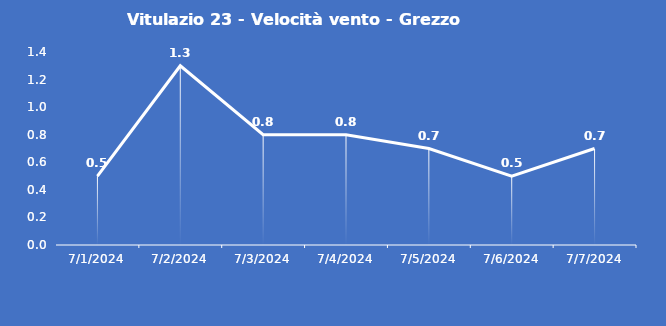
| Category | Vitulazio 23 - Velocità vento - Grezzo (m/s) |
|---|---|
| 7/1/24 | 0.5 |
| 7/2/24 | 1.3 |
| 7/3/24 | 0.8 |
| 7/4/24 | 0.8 |
| 7/5/24 | 0.7 |
| 7/6/24 | 0.5 |
| 7/7/24 | 0.7 |